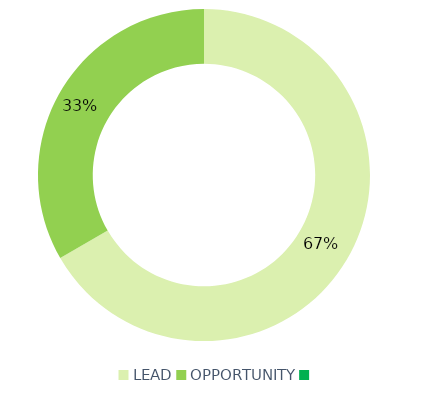
| Category | Series 0 |
|---|---|
| LEAD | 44 |
| OPPORTUNITY | 22 |